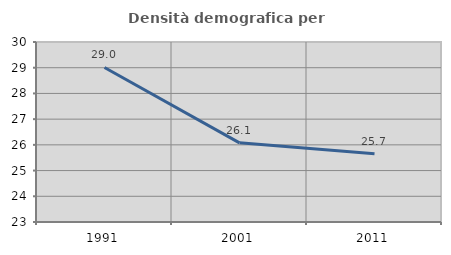
| Category | Densità demografica |
|---|---|
| 1991.0 | 29.009 |
| 2001.0 | 26.078 |
| 2011.0 | 25.65 |